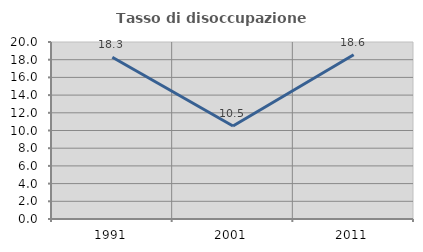
| Category | Tasso di disoccupazione giovanile  |
|---|---|
| 1991.0 | 18.273 |
| 2001.0 | 10.511 |
| 2011.0 | 18.565 |